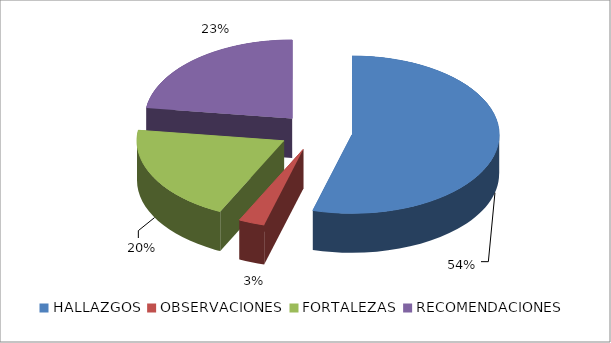
| Category | Series 0 |
|---|---|
| HALLAZGOS | 19 |
| OBSERVACIONES | 1 |
| FORTALEZAS | 7 |
| RECOMENDACIONES | 8 |